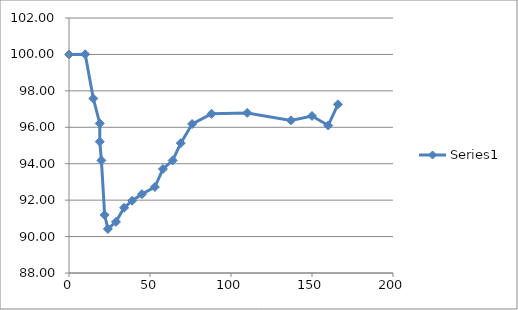
| Category | Series 0 |
|---|---|
| 0.0 | 100 |
| 10.0 | 100.01 |
| 15.0 | 97.58 |
| 19.0 | 96.21 |
| 19.0 | 95.21 |
| 20.0 | 94.18 |
| 22.0 | 91.19 |
| 24.0 | 90.42 |
| 29.0 | 90.81 |
| 34.0 | 91.58 |
| 39.0 | 91.97 |
| 45.0 | 92.33 |
| 53.0 | 92.72 |
| 58.0 | 93.71 |
| 64.0 | 94.18 |
| 69.0 | 95.13 |
| 76.0 | 96.18 |
| 88.0 | 96.74 |
| 110.0 | 96.79 |
| 137.0 | 96.38 |
| 150.0 | 96.62 |
| 160.0 | 96.1 |
| 166.0 | 97.26 |